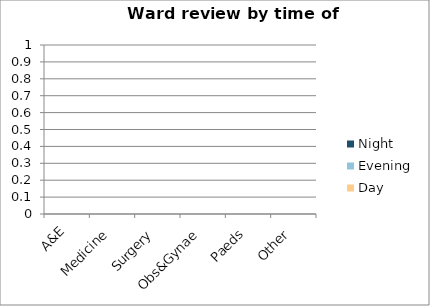
| Category | Day | Evening | Night |
|---|---|---|---|
| A&E | 0 | 0 | 0 |
| Medicine | 0 | 0 | 0 |
| Surgery | 0 | 0 | 0 |
| Obs&Gynae | 0 | 0 | 0 |
| Paeds | 0 | 0 | 0 |
| Other | 0 | 0 | 0 |